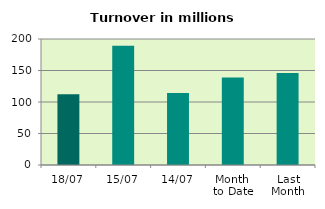
| Category | Series 0 |
|---|---|
| 18/07 | 112.113 |
| 15/07 | 189.162 |
| 14/07 | 114.448 |
| Month 
to Date | 138.937 |
| Last
Month | 145.879 |